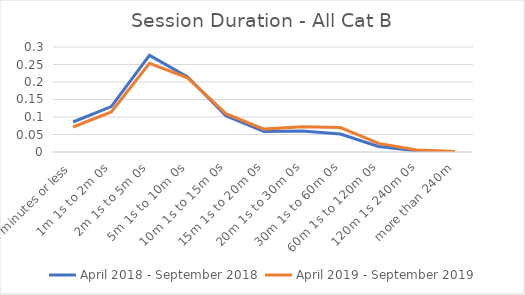
| Category | April 2018 - September 2018 | April 2019 - September 2019 |
|---|---|---|
| 1 minutes or less | 0.086 | 0.071 |
| 1m 1s to 2m 0s | 0.13 | 0.115 |
| 2m 1s to 5m 0s | 0.276 | 0.253 |
| 5m 1s to 10m 0s | 0.214 | 0.212 |
| 10m 1s to 15m 0s | 0.104 | 0.11 |
| 15m 1s to 20m 0s | 0.058 | 0.065 |
| 20m 1s to 30m 0s | 0.06 | 0.072 |
| 30m 1s to 60m 0s | 0.051 | 0.07 |
| 60m 1s to 120m 0s | 0.016 | 0.025 |
| 120m 1s 240m 0s | 0.003 | 0.006 |
| more than 240m | 0.001 | 0.001 |